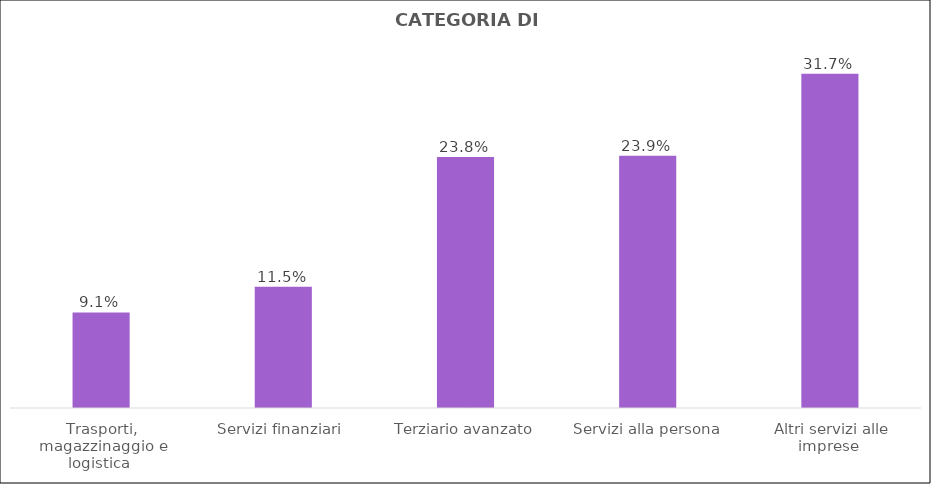
| Category | Series 0 |
|---|---|
| Trasporti, magazzinaggio e logistica  | 0.091 |
| Servizi finanziari  | 0.115 |
| Terziario avanzato | 0.238 |
| Servizi alla persona | 0.239 |
| Altri servizi alle imprese  | 0.317 |